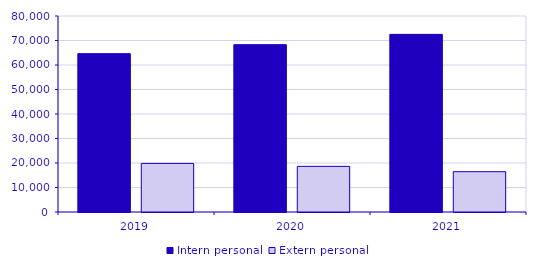
| Category | Intern personal | Extern personal |
|---|---|---|
| 2019.0 | 64641 | 19832 |
| 2020.0 | 68303 | 18628 |
| 2021.0 | 72501 | 16452 |